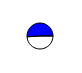
| Category | Series 0 |
|---|---|
| 0 | 5040149 |
| 1 | 5241551 |